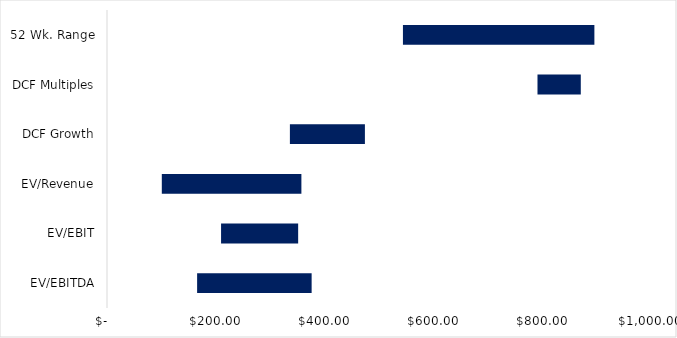
| Category | Q1 | Spread |
|---|---|---|
| EV/EBITDA | 165.652 | 210.512 |
| EV/EBIT | 209.68 | 141.713 |
| EV/Revenue | 100.749 | 256.594 |
| DCF Growth | 336.206 | 137.886 |
| DCF Multiples | 791.342 | 79.606 |
| 52 Wk. Range | 544 | 351.93 |